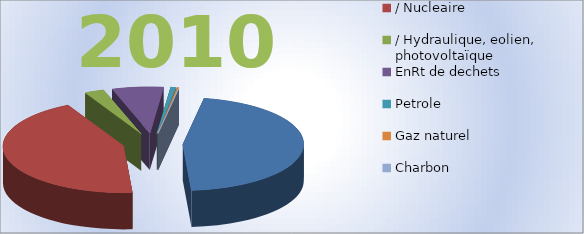
| Category | 2010 |
|---|---|
| Electricité primaire | 118.4 |
| / Nucleaire | 111.7 |
| / Hydraulique, eolien, photovoltaïque | 6.7 |
| EnRt de dechets | 17.6 |
| Petrole | 1.8 |
| Gaz naturel | 0.6 |
| Charbon | 0.1 |